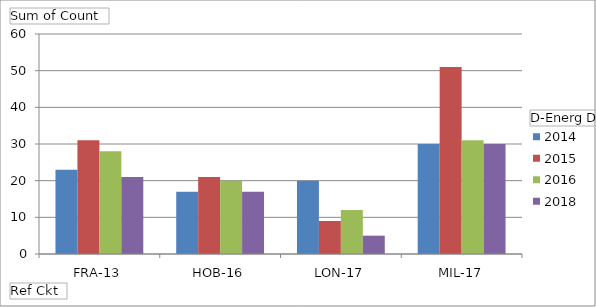
| Category | 2014 | 2015 | 2016 | 2018 |
|---|---|---|---|---|
| FRA-13 | 23 | 31 | 28 | 21 |
| HOB-16 | 17 | 21 | 20 | 17 |
| LON-17 | 20 | 9 | 12 | 5 |
| MIL-17 | 30 | 51 | 31 | 30 |